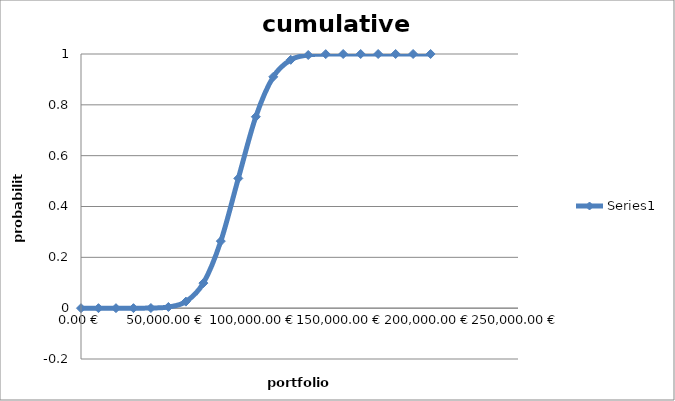
| Category | Series 0 |
|---|---|
| 0.0 | 0 |
| 10000.0 | 0 |
| 20000.0 | 0 |
| 30000.0 | 0 |
| 40000.0 | 0.001 |
| 50000.0 | 0.005 |
| 60000.0 | 0.026 |
| 70000.0 | 0.099 |
| 80000.0 | 0.264 |
| 90000.0 | 0.51 |
| 100000.0 | 0.753 |
| 110000.0 | 0.91 |
| 120000.0 | 0.977 |
| 130000.0 | 0.996 |
| 140000.0 | 1 |
| 150000.0 | 1 |
| 160000.0 | 1 |
| 170000.0 | 1 |
| 180000.0 | 1 |
| 190000.0 | 1 |
| 200000.0 | 1 |